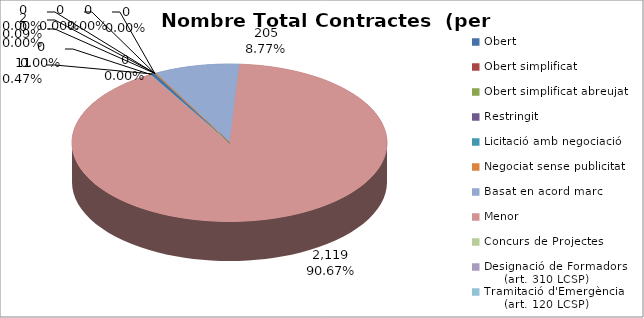
| Category | Nombre Total Contractes |
|---|---|
| Obert | 11 |
| Obert simplificat | 0 |
| Obert simplificat abreujat | 0 |
| Restringit | 0 |
| Licitació amb negociació | 0 |
| Negociat sense publicitat | 2 |
| Basat en acord marc | 205 |
| Menor | 2119 |
| Concurs de Projectes | 0 |
| Designació de Formadors
     (art. 310 LCSP) | 0 |
| Tramitació d'Emergència
     (art. 120 LCSP) | 0 |